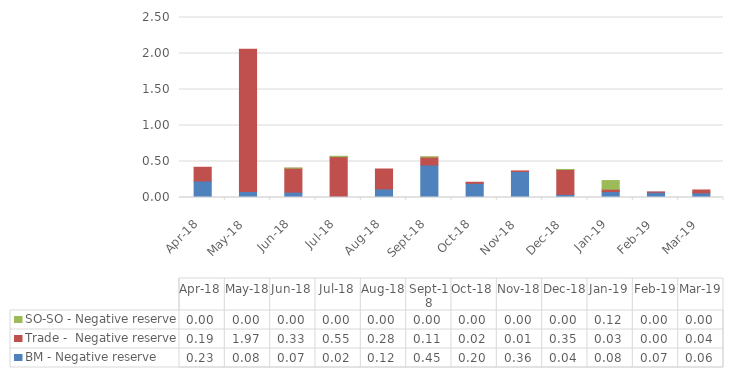
| Category | BM - Negative reserve | Trade -  Negative reserve | SO-SO - Negative reserve |
|---|---|---|---|
| 2018-04-30 | 0.229 | 0.191 | 0 |
| 2018-05-31 | 0.084 | 1.974 | 0 |
| 2018-06-30 | 0.075 | 0.332 | 0.001 |
| 2018-07-31 | 0.017 | 0.551 | 0.004 |
| 2018-08-31 | 0.119 | 0.277 | 0 |
| 2018-09-30 | 0.452 | 0.109 | 0.003 |
| 2018-10-31 | 0.197 | 0.015 | 0 |
| 2018-11-30 | 0.361 | 0.008 | 0 |
| 2018-12-31 | 0.044 | 0.345 | 0.001 |
| 2019-01-31 | 0.082 | 0.033 | 0.12 |
| 2019-02-28 | 0.072 | 0.005 | 0 |
| 2019-03-31 | 0.065 | 0.04 | 0 |